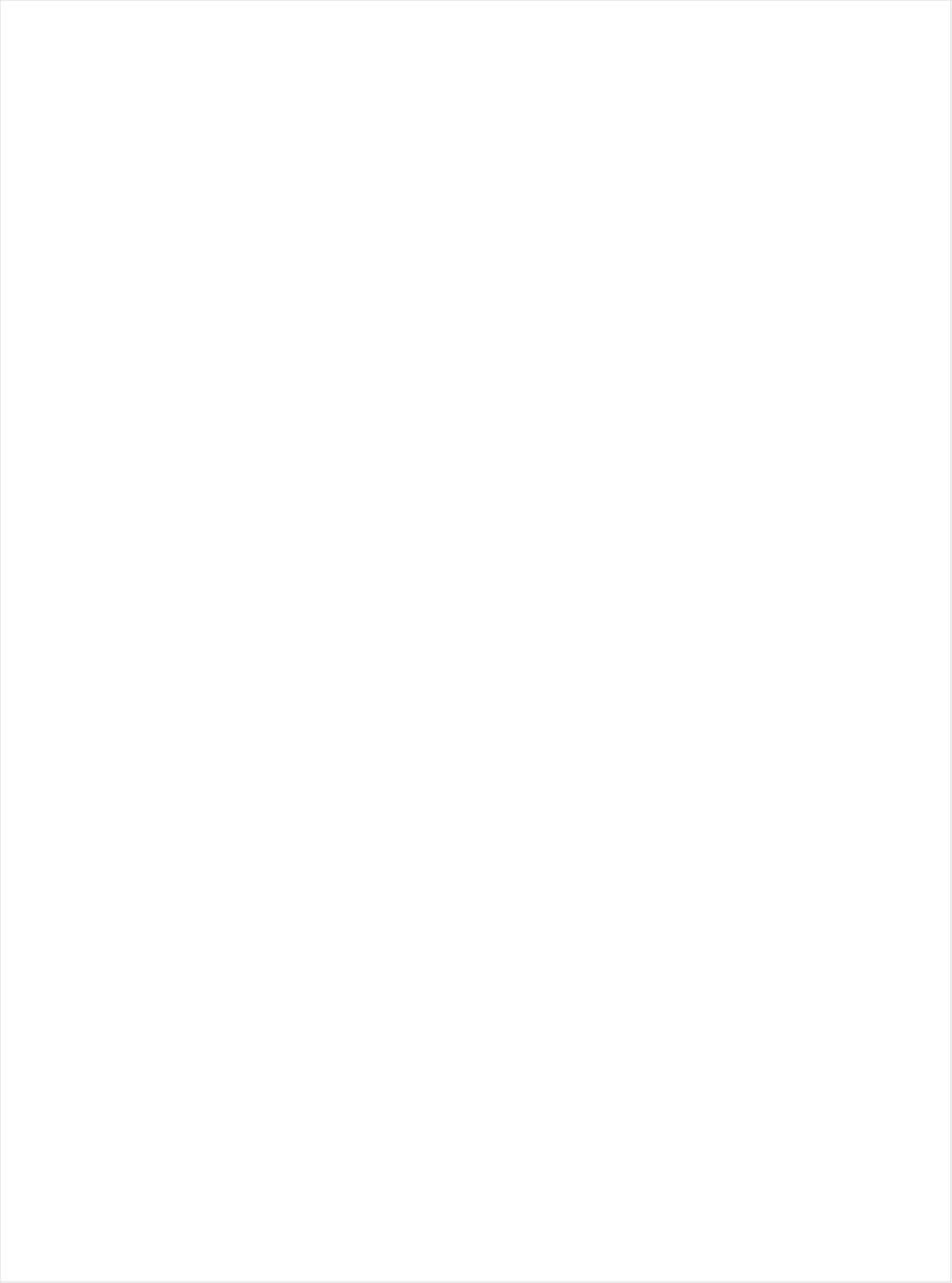
| Category | Total |
|---|---|
| UniMas | -0.665 |
| Telemundo | -0.66 |
| Univision | -0.606 |
| Galavision | -0.605 |
| NBC Universo | -0.584 |
| TUDN | -0.513 |
| Cartoon Network | -0.27 |
| Hallmark Movies & Mysteries | -0.263 |
| Hallmark | -0.218 |
| UP TV | -0.176 |
| Logo | -0.164 |
| Lifetime Movies | -0.162 |
| TLC | -0.141 |
| Nick Toons | -0.114 |
| Adult Swim | -0.113 |
| Disney Channel | -0.11 |
| Discovery Life Channel | -0.107 |
| WE TV | -0.106 |
| Nick | -0.1 |
| Disney XD | -0.095 |
| Investigation Discovery | -0.095 |
| PBS | -0.092 |
| Travel | -0.09 |
| Lifetime | -0.09 |
| INSP | -0.089 |
| Teen Nick | -0.064 |
| Oprah Winfrey Network | -0.06 |
| Nick@Nite | -0.058 |
| RFD TV | -0.058 |
| OXYGEN | -0.054 |
| VH1 | -0.032 |
| BET | -0.031 |
| Science Channel | -0.03 |
| Nick Jr. | -0.029 |
| Headline News | -0.025 |
| ION | -0.025 |
| POP | -0.023 |
| Discovery Family Channel | -0.018 |
| Great American Country | -0.017 |
| E! | -0.003 |
| TV LAND | 0.001 |
| Universal Kids | 0.003 |
| BRAVO | 0.008 |
| CMTV | 0.012 |
| Weather Channel | 0.023 |
| Disney Junior US | 0.025 |
| HGTV | 0.033 |
| Animal Planet | 0.036 |
| MSNBC | 0.036 |
| MTV2 | 0.042 |
| CW | 0.048 |
| BET Her | 0.057 |
| Fox Business | 0.061 |
| SundanceTV | 0.082 |
| Motor Trend Network | 0.084 |
| A&E | 0.087 |
| Freeform | 0.09 |
| USA Network | 0.091 |
| National Geographic Wild | 0.093 |
| FXX | 0.096 |
| TV ONE | 0.097 |
| SYFY | 0.097 |
| Fox News | 0.109 |
| Ovation | 0.114 |
| Reelz Channel | 0.116 |
| History Channel | 0.122 |
| FYI | 0.125 |
| Discovery Channel | 0.128 |
| Food Network | 0.129 |
| CBS | 0.133 |
| WGN America | 0.134 |
| ABC | 0.135 |
| MTV | 0.136 |
| FX Movie Channel | 0.136 |
| NBC | 0.142 |
| TBS | 0.144 |
| Smithsonian | 0.146 |
| DIY | 0.154 |
| FX | 0.156 |
| CNN | 0.161 |
| Game Show | 0.163 |
| AMC | 0.172 |
| National Geographic | 0.173 |
| Cooking Channel | 0.178 |
| American Heroes Channel | 0.194 |
| Bloomberg HD | 0.197 |
| TNT | 0.203 |
| BBC America | 0.204 |
| Paramount Network | 0.206 |
| CNBC | 0.215 |
| Outdoor Channel | 0.225 |
| Destination America | 0.231 |
| truTV | 0.235 |
| Comedy Central | 0.265 |
| Independent Film (IFC) | 0.27 |
| Tennis Channel | 0.278 |
| FOX | 0.282 |
| Viceland | 0.31 |
| The Sportsman Channel | 0.334 |
| MyNetworkTV | 0.366 |
| FXDEP | 0.454 |
| FOX Sports 2 | 0.49 |
| Olympic Channel | 0.525 |
| Fox Sports 1 | 0.532 |
| CBS Sports | 0.541 |
| NBC Sports | 0.552 |
| NHL | 0.603 |
| ESPN Deportes | 0.679 |
| PAC-12 Network | 0.685 |
| Golf | 0.71 |
| MLB Network | 0.721 |
| Big Ten Network | 0.727 |
| ESPNU | 0.742 |
| ESPNEWS | 0.762 |
| NBA TV | 0.766 |
| ESPN2 | 0.778 |
| ESPN | 0.781 |
| NFL Network | 1.027 |